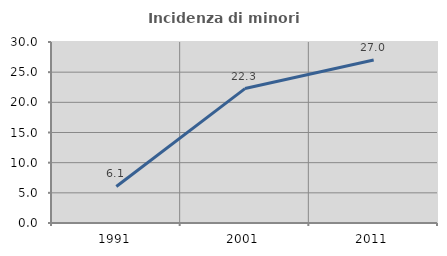
| Category | Incidenza di minori stranieri |
|---|---|
| 1991.0 | 6.061 |
| 2001.0 | 22.28 |
| 2011.0 | 27.005 |